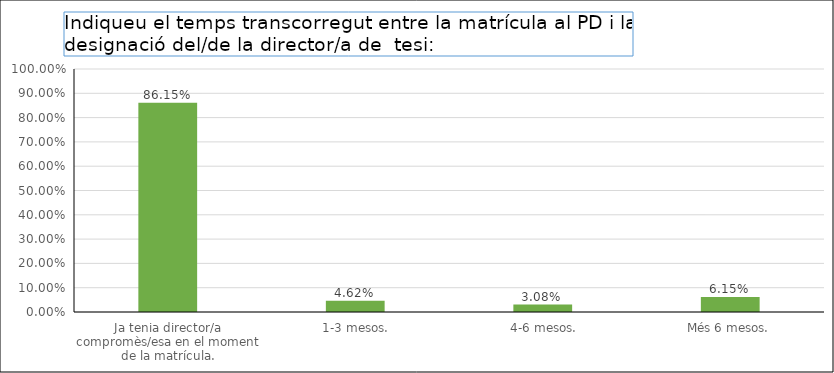
| Category | Series 0 |
|---|---|
| Ja tenia director/a compromès/esa en el moment de la matrícula. | 0.862 |
|  1-3 mesos. | 0.046 |
|  4-6 mesos. | 0.031 |
| Més 6 mesos. | 0.062 |